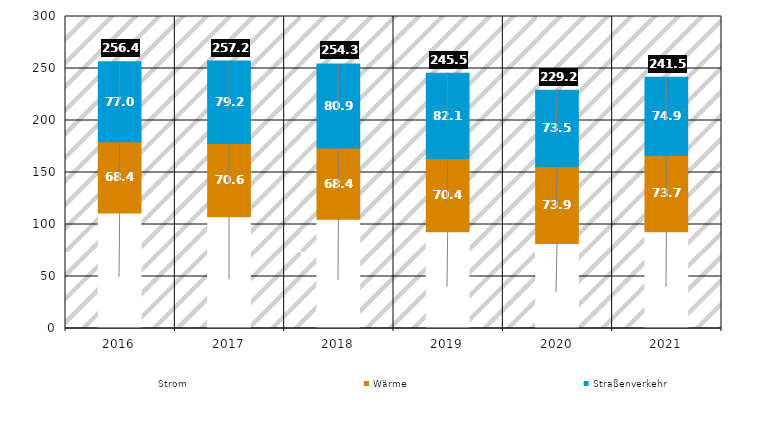
| Category | Strom | Wärme | Straßenverkehr |
|---|---|---|---|
| 2016.0 | 111.013 | 68.441 | 76.986 |
| 2017.0 | 107.341 | 70.586 | 79.242 |
| 2018.0 | 105.001 | 68.449 | 80.893 |
| 2019.0 | 92.969 | 70.423 | 82.084 |
| 2020.0 | 81.795 | 73.894 | 73.487 |
| 2021.0 | 93.027 | 73.654 | 74.86 |